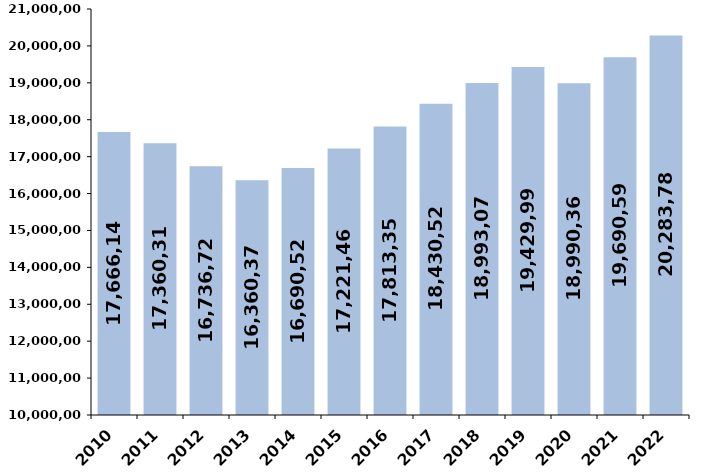
| Category | % de variación
 interanual |
|---|---|
| 2010 | 17666149.05 |
| 2011 | 17360312.55 |
| 2012 | 16736726.63 |
| 2013 | 16360372.52 |
| 2014 | 16690519.73 |
| 2015 | 17221466.52 |
| 2016 | 17813355.9 |
| 2017 | 18430529.03 |
| 2018 | 18993072.81 |
| 2019 | 19429992.65 |
| 2020 | 18990364 |
| 2021 | 19690590 |
| 2022 | 20283786.4 |